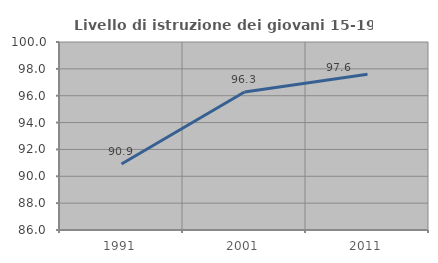
| Category | Livello di istruzione dei giovani 15-19 anni |
|---|---|
| 1991.0 | 90.909 |
| 2001.0 | 96.273 |
| 2011.0 | 97.6 |